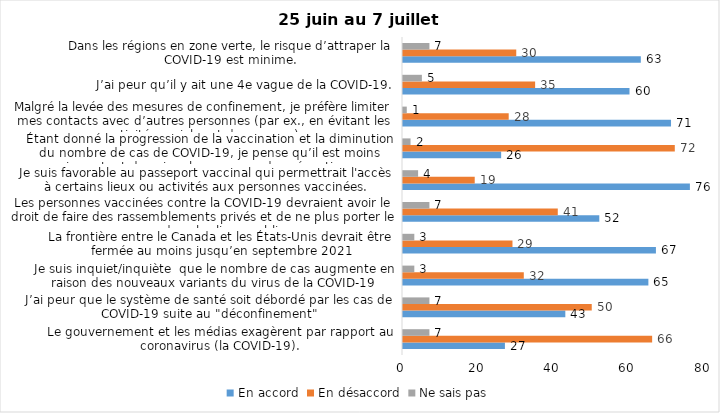
| Category | En accord | En désaccord | Ne sais pas |
|---|---|---|---|
| Le gouvernement et les médias exagèrent par rapport au coronavirus (la COVID-19). | 27 | 66 | 7 |
| J’ai peur que le système de santé soit débordé par les cas de COVID-19 suite au "déconfinement" | 43 | 50 | 7 |
| Je suis inquiet/inquiète  que le nombre de cas augmente en raison des nouveaux variants du virus de la COVID-19 | 65 | 32 | 3 |
| La frontière entre le Canada et les États-Unis devrait être fermée au moins jusqu’en septembre 2021 | 67 | 29 | 3 |
| Les personnes vaccinées contre la COVID-19 devraient avoir le droit de faire des rassemblements privés et de ne plus porter le masque dans les lieux publics. | 52 | 41 | 7 |
| Je suis favorable au passeport vaccinal qui permettrait l'accès à certains lieux ou activités aux personnes vaccinées. | 76 | 19 | 4 |
| Étant donné la progression de la vaccination et la diminution du nombre de cas de COVID-19, je pense qu’il est moins important de suivre les mesures de prévention. | 26 | 72 | 2 |
| Malgré la levée des mesures de confinement, je préfère limiter mes contacts avec d’autres personnes (par ex., en évitant les activités sociales et de groupes) | 71 | 28 | 1 |
| J’ai peur qu’il y ait une 4e vague de la COVID-19. | 60 | 35 | 5 |
| Dans les régions en zone verte, le risque d’attraper la COVID-19 est minime. | 63 | 30 | 7 |